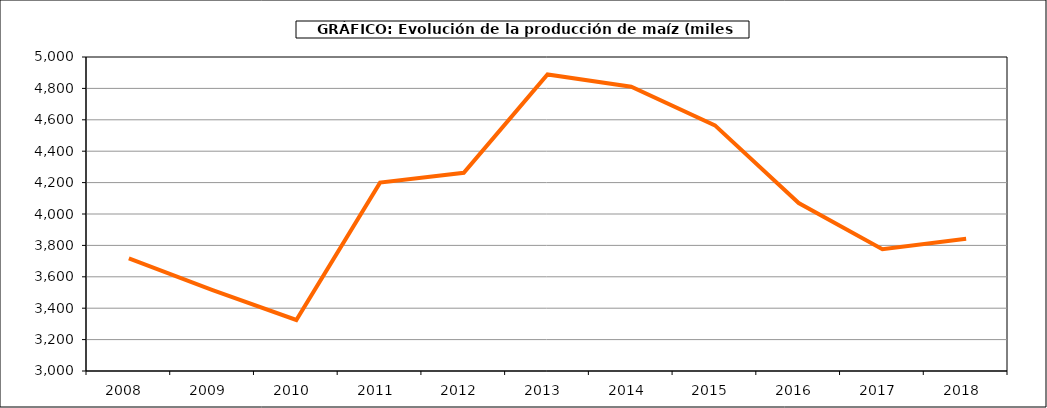
| Category | Superficie |
|---|---|
| 2008.0 | 3717.671 |
| 2009.0 | 3515.617 |
| 2010.0 | 3324.821 |
| 2011.0 | 4199.927 |
| 2012.0 | 4262.116 |
| 2013.0 | 4888.462 |
| 2014.0 | 4810.645 |
| 2015.0 | 4564.416 |
| 2016.0 | 4069.508 |
| 2017.0 | 3775.645 |
| 2018.0 | 3842.519 |